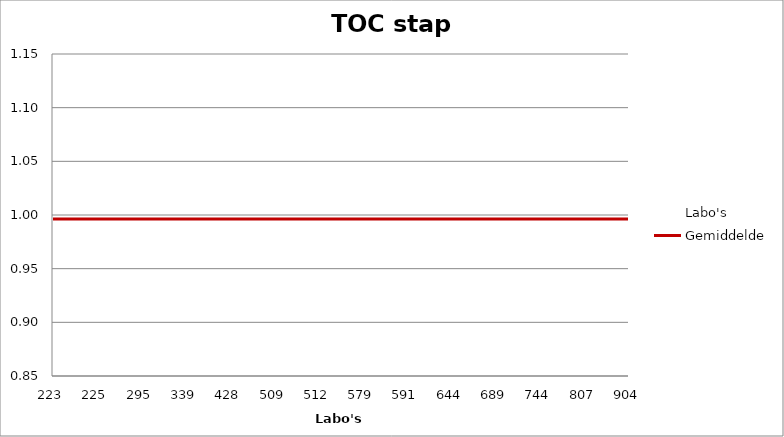
| Category | Labo's | Gemiddelde |
|---|---|---|
| 223.0 | 0.97 | 0.996 |
| 225.0 | 0.9 | 0.996 |
| 295.0 | 1 | 0.996 |
| 339.0 | 1.09 | 0.996 |
| 428.0 | 1 | 0.996 |
| 509.0 | 1.02 | 0.996 |
| 512.0 | 1.02 | 0.996 |
| 579.0 | 0.98 | 0.996 |
| 591.0 | 0.95 | 0.996 |
| 644.0 | 1.01 | 0.996 |
| 689.0 | 0.97 | 0.996 |
| 744.0 | 1.03 | 0.996 |
| 807.0 | 1 | 0.996 |
| 904.0 | 1.02 | 0.996 |